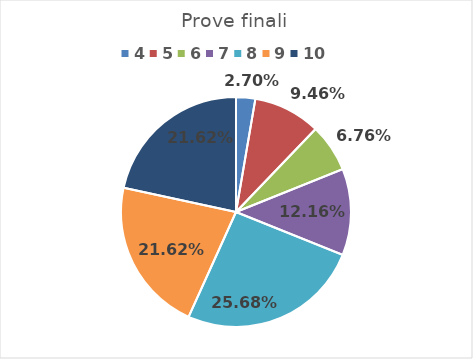
| Category | Series 0 |
|---|---|
| 4.0 | 0.027 |
| 5.0 | 0.095 |
| 6.0 | 0.068 |
| 7.0 | 0.122 |
| 8.0 | 0.257 |
| 9.0 | 0.216 |
| 10.0 | 0.216 |